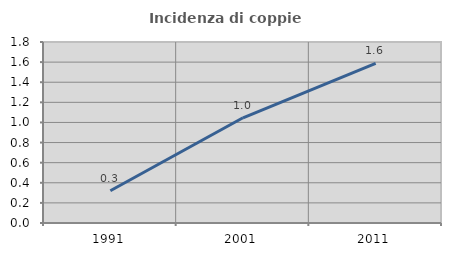
| Category | Incidenza di coppie miste |
|---|---|
| 1991.0 | 0.321 |
| 2001.0 | 1.046 |
| 2011.0 | 1.587 |